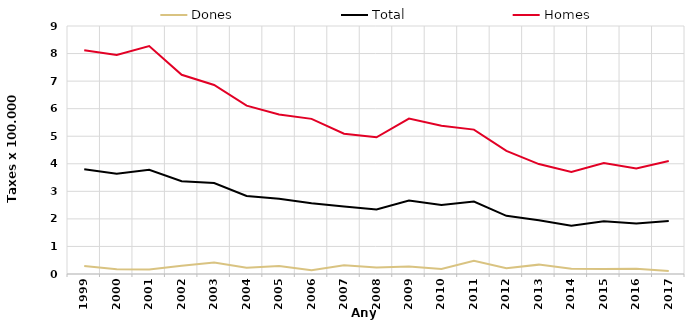
| Category | Dones | Total | Homes |
|---|---|---|---|
| 1999.0 | 0.29 | 3.8 | 8.12 |
| 2000.0 | 0.17 | 3.64 | 7.95 |
| 2001.0 | 0.16 | 3.78 | 8.27 |
| 2002.0 | 0.3 | 3.37 | 7.23 |
| 2003.0 | 0.42 | 3.3 | 6.86 |
| 2004.0 | 0.23 | 2.83 | 6.11 |
| 2005.0 | 0.29 | 2.73 | 5.79 |
| 2006.0 | 0.14 | 2.57 | 5.63 |
| 2007.0 | 0.32 | 2.45 | 5.09 |
| 2008.0 | 0.24 | 2.34 | 4.96 |
| 2009.0 | 0.27 | 2.67 | 5.64 |
| 2010.0 | 0.18 | 2.5 | 5.38 |
| 2011.0 | 0.48 | 2.63 | 5.24 |
| 2012.0 | 0.21 | 2.11 | 4.47 |
| 2013.0 | 0.34 | 1.95 | 3.99 |
| 2014.0 | 0.19 | 1.75 | 3.7 |
| 2015.0 | 0.18 | 1.91 | 4.03 |
| 2016.0 | 0.19 | 1.83 | 3.83 |
| 2017.0 | 0.11 | 1.92 | 4.1 |